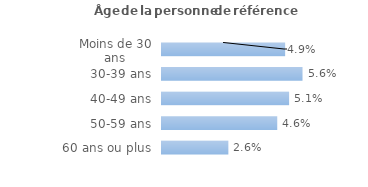
| Category | Series 0 |
|---|---|
| Moins de 30 ans | 0.049 |
| 30-39 ans | 0.056 |
| 40-49 ans | 0.051 |
| 50-59 ans | 0.046 |
| 60 ans ou plus | 0.026 |